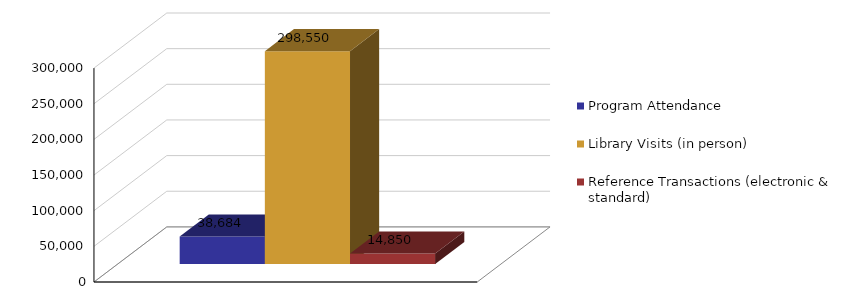
| Category | Program Attendance | Library Visits (in person) | Reference Transactions (electronic & standard) |
|---|---|---|---|
|  | 38684 | 298550 | 14850 |